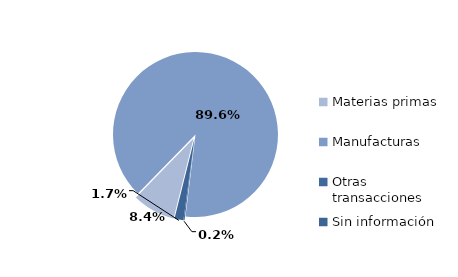
| Category | Series 0 |
|---|---|
| Materias primas | 1983.734 |
| Manufacturas | 21147.124 |
| Otras transacciones | 51.667 |
| Sin información | 410.509 |